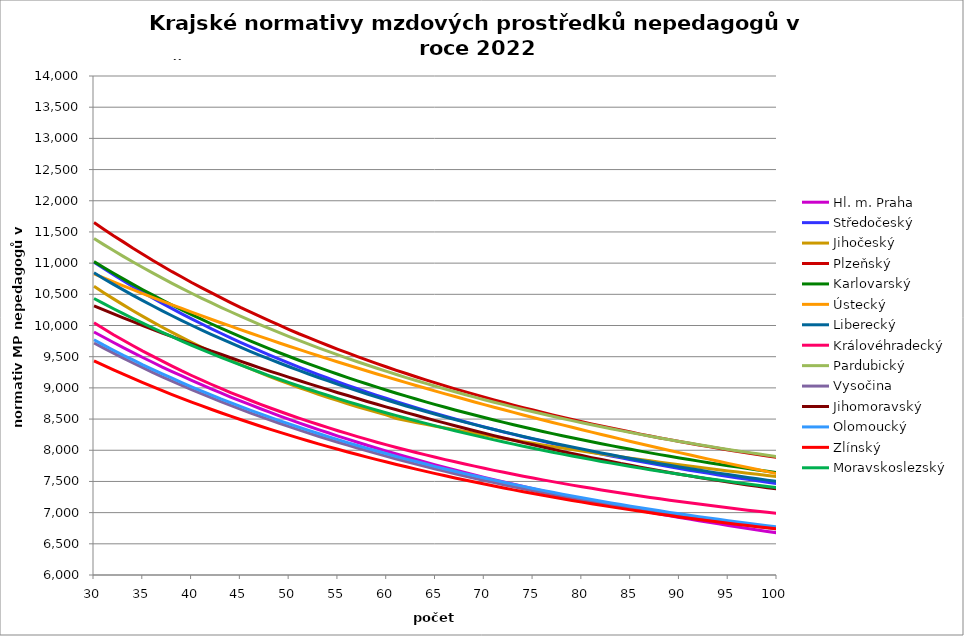
| Category | Hl. m. Praha | Středočeský | Jihočeský | Plzeňský | Karlovarský  | Ústecký   | Liberecký | Královéhradecký | Pardubický | Vysočina | Jihomoravský | Olomoucký | Zlínský | Moravskoslezský |
|---|---|---|---|---|---|---|---|---|---|---|---|---|---|---|
| 30.0 | 9896.653 | 11013.812 | 10629.666 | 11651.816 | 11023.563 | 10827.84 | 10844.475 | 10043.966 | 11394.183 | 9720.182 | 10314.233 | 9770.792 | 9433.517 | 10433.238 |
| 31.0 | 9811.13 | 10912.276 | 10526.706 | 11544.662 | 10929.124 | 10763.26 | 10750.876 | 9947.492 | 11296.568 | 9636.99 | 10249.816 | 9684.42 | 9360.437 | 10350.162 |
| 32.0 | 9727.073 | 10813.371 | 10426.946 | 11439.461 | 10837.004 | 10699.447 | 10659.589 | 9852.854 | 11201.352 | 9555.843 | 10186.199 | 9603.068 | 9289.037 | 10269.034 |
| 33.0 | 9644.444 | 10717.002 | 10330.261 | 11340.613 | 10747.129 | 10636.385 | 10570.537 | 9763.408 | 11108.455 | 9476.363 | 10123.367 | 9523.071 | 9219.264 | 10189.794 |
| 34.0 | 9566.431 | 10623.085 | 10236.533 | 11239.081 | 10659.426 | 10574.062 | 10483.647 | 9675.571 | 11017.803 | 9399.113 | 10061.305 | 9447.79 | 9151.071 | 10112.384 |
| 35.0 | 9486.497 | 10531.533 | 10145.649 | 11143.651 | 10573.823 | 10512.466 | 10398.849 | 9589.3 | 10929.322 | 9323.716 | 10000 | 9370.349 | 9084.411 | 10036.748 |
| 36.0 | 9411.008 | 10442.269 | 10057.504 | 11045.601 | 10490.256 | 10451.583 | 10316.076 | 9507.786 | 10842.945 | 9250.112 | 9939.437 | 9297.454 | 9019.238 | 9962.834 |
| 37.0 | 9333.64 | 10355.216 | 9971.998 | 10953.414 | 10408.66 | 10391.401 | 10235.265 | 9427.647 | 10758.606 | 9177.954 | 9879.603 | 9225.684 | 8955.511 | 9890.59 |
| 38.0 | 9260.555 | 10270.301 | 9889.034 | 10862.754 | 10328.974 | 10331.908 | 10156.354 | 9348.847 | 10676.241 | 9107.776 | 9820.486 | 9155.014 | 8893.186 | 9819.967 |
| 39.0 | 9191.58 | 10187.455 | 9808.523 | 10777.604 | 10251.139 | 10273.093 | 10079.285 | 9271.353 | 10595.789 | 9038.946 | 9762.071 | 9085.418 | 8832.226 | 9750.919 |
| 40.0 | 9120.694 | 10106.611 | 9730.379 | 10689.819 | 10175.1 | 10214.943 | 10004.002 | 9198.158 | 10517.194 | 8971.987 | 9704.348 | 9016.872 | 8772.59 | 9683.401 |
| 41.0 | 9050.893 | 10027.707 | 9654.52 | 10607.348 | 10100.803 | 10157.448 | 9930.45 | 9129.089 | 10440.398 | 8906.563 | 9647.303 | 8952.4 | 8714.244 | 9617.369 |
| 42.0 | 8984.995 | 9950.681 | 9580.868 | 10526.139 | 10028.196 | 10100.597 | 9858.58 | 9058.115 | 10365.35 | 8842.357 | 9590.925 | 8888.844 | 8657.151 | 9552.781 |
| 43.0 | 8920.05 | 9875.476 | 9509.349 | 10446.165 | 9957.23 | 10044.378 | 9788.34 | 8991.125 | 10291.998 | 8779.873 | 9538.462 | 8823.221 | 8601.277 | 9489.598 |
| 44.0 | 8853.275 | 9802.036 | 9439.894 | 10367.397 | 9887.857 | 9988.782 | 9719.684 | 8925.12 | 10220.294 | 8718.793 | 9483.345 | 8764.4 | 8546.591 | 9427.781 |
| 45.0 | 8790.214 | 9730.307 | 9372.436 | 10289.808 | 9820.033 | 9933.798 | 9652.567 | 8862.884 | 10150.189 | 8658.816 | 9428.861 | 8703.476 | 8493.059 | 9367.293 |
| 46.0 | 8730.729 | 9660.239 | 9306.91 | 10216.985 | 9753.712 | 9879.416 | 9586.944 | 8801.511 | 10081.638 | 8600.686 | 9375 | 8643.393 | 8440.653 | 9308.098 |
| 47.0 | 8669.395 | 9591.782 | 9243.257 | 10145.186 | 9688.854 | 9825.626 | 9522.773 | 8740.982 | 10014.6 | 8543.331 | 9321.751 | 8586.937 | 8389.342 | 9250.163 |
| 48.0 | 8611.529 | 9524.889 | 9181.418 | 10074.389 | 9625.417 | 9772.419 | 9460.015 | 8681.279 | 9949.03 | 8487.236 | 9269.103 | 8531.213 | 8339.1 | 9193.454 |
| 49.0 | 8551.853 | 9459.517 | 9121.337 | 10004.574 | 9563.364 | 9719.785 | 9398.63 | 8625.046 | 9884.89 | 8432.613 | 9220.093 | 8476.209 | 8289.897 | 9137.939 |
| 50.0 | 8495.54 | 9395.62 | 9062.963 | 9935.719 | 9502.656 | 9667.714 | 9338.581 | 8569.537 | 9822.141 | 8379.175 | 9168.584 | 8421.909 | 8241.71 | 9083.588 |
| 51.0 | 8439.964 | 9333.158 | 9006.244 | 9867.806 | 9443.257 | 9616.199 | 9279.832 | 8514.738 | 9760.746 | 8326.651 | 9117.647 | 8368.3 | 8194.511 | 9030.372 |
| 52.0 | 8385.111 | 9272.09 | 8951.134 | 9804.143 | 9385.134 | 9565.23 | 9222.349 | 8463.196 | 9700.668 | 8275.494 | 9067.273 | 8318.001 | 8148.278 | 8978.261 |
| 53.0 | 8330.966 | 9212.379 | 8897.585 | 9741.296 | 9328.252 | 9514.798 | 9166.098 | 8412.274 | 9641.874 | 8225.196 | 9020.369 | 8268.302 | 8102.986 | 8927.229 |
| 54.0 | 8279.93 | 9153.987 | 8845.555 | 9679.249 | 9272.58 | 9464.895 | 9111.048 | 8361.962 | 9584.33 | 8175.97 | 8971.061 | 8219.193 | 8058.612 | 8877.248 |
| 55.0 | 8227.13 | 9096.878 | 8795 | 9617.988 | 9218.086 | 9415.513 | 9057.167 | 8312.247 | 9528.005 | 8128.246 | 8922.29 | 8170.665 | 8015.136 | 8828.294 |
| 56.0 | 8177.355 | 9041.02 | 8745.882 | 9560.662 | 9164.742 | 9366.644 | 9004.427 | 8265.563 | 9472.867 | 8081.303 | 8876.869 | 8122.706 | 7972.535 | 8780.342 |
| 57.0 | 8128.179 | 8986.378 | 8698.161 | 9500.888 | 9112.517 | 9318.279 | 8952.797 | 8219.4 | 9418.886 | 8035.123 | 8829.114 | 8075.307 | 7930.79 | 8733.368 |
| 58.0 | 8079.59 | 8932.922 | 8651.801 | 9444.946 | 9061.385 | 9270.411 | 8902.251 | 8173.75 | 9366.035 | 7989.91 | 8781.87 | 8030.91 | 7889.88 | 8687.348 |
| 59.0 | 8031.579 | 8880.62 | 8606.767 | 9389.659 | 9011.319 | 9223.032 | 8852.762 | 8128.605 | 9314.286 | 7945.642 | 8737.864 | 7986.999 | 7849.787 | 8642.261 |
| 60.0 | 7986.382 | 8829.444 | 8563.026 | 9335.015 | 8962.293 | 9176.136 | 8804.304 | 8086.293 | 9263.611 | 7902.511 | 8691.589 | 7943.565 | 7810.492 | 8598.085 |
| 61.0 | 7939.469 | 8779.365 | 8508.044 | 9281.003 | 8914.282 | 9129.713 | 8756.852 | 8044.419 | 9213.986 | 7860.275 | 8648.481 | 7900.601 | 7771.978 | 8554.8 |
| 62.0 | 7895.299 | 8730.356 | 8476.848 | 9230.563 | 8867.261 | 9083.758 | 8710.383 | 8005.268 | 9165.385 | 7818.7 | 8603.145 | 7858.099 | 7734.226 | 8512.385 |
| 63.0 | 7851.618 | 8682.39 | 8446.115 | 9177.75 | 8821.209 | 9038.264 | 8664.874 | 7964.227 | 9117.784 | 7778.192 | 8560.908 | 7818.376 | 7697.221 | 8470.821 |
| 64.0 | 7808.418 | 8635.443 | 8415.838 | 9128.422 | 8776.102 | 8993.223 | 8620.301 | 7925.85 | 9071.161 | 7738.309 | 8516.484 | 7779.053 | 7660.946 | 8430.09 |
| 65.0 | 7765.691 | 8589.49 | 8386.009 | 9079.623 | 8731.919 | 8948.628 | 8576.645 | 7887.842 | 9025.492 | 7699.45 | 8475.091 | 7737.846 | 7625.385 | 8390.173 |
| 66.0 | 7723.429 | 8544.506 | 8356.62 | 9031.342 | 8688.639 | 8904.474 | 8533.882 | 7850.197 | 8980.757 | 7661.386 | 8434.099 | 7699.327 | 7590.524 | 8351.052 |
| 67.0 | 7683.703 | 8500.471 | 8327.666 | 8983.572 | 8646.242 | 8860.753 | 8491.995 | 7815.092 | 8936.935 | 7624.101 | 8393.502 | 7663.422 | 7556.348 | 8312.711 |
| 68.0 | 7642.326 | 8457.36 | 8299.138 | 8939.071 | 8604.708 | 8817.459 | 8450.963 | 7780.301 | 8894.004 | 7587.176 | 8353.293 | 7625.638 | 7522.843 | 8275.134 |
| 69.0 | 7603.429 | 8415.154 | 8271.031 | 8895.009 | 8564.018 | 8774.587 | 8410.767 | 7745.817 | 8851.946 | 7551.399 | 8313.468 | 7590.416 | 7489.995 | 8238.303 |
| 70.0 | 7564.925 | 8373.832 | 8243.338 | 8851.38 | 8524.155 | 8732.129 | 8371.389 | 7711.638 | 8810.742 | 7516.349 | 8274.021 | 7555.517 | 7457.79 | 8202.205 |
| 71.0 | 7526.81 | 8333.373 | 8216.052 | 8808.176 | 8485.099 | 8690.08 | 8332.812 | 7677.759 | 8770.374 | 7481.818 | 8234.947 | 7520.938 | 7426.216 | 8166.823 |
| 72.0 | 7491.053 | 8293.76 | 8189.167 | 8765.392 | 8446.835 | 8648.435 | 8295.018 | 7646.267 | 8730.823 | 7448.18 | 8196.24 | 7486.674 | 7395.26 | 8132.144 |
| 73.0 | 7453.676 | 8254.973 | 8162.677 | 8723.021 | 8409.346 | 8607.186 | 8257.992 | 7615.033 | 8692.074 | 7414.842 | 8160.281 | 7452.721 | 7364.911 | 8098.154 |
| 74.0 | 7418.61 | 8216.994 | 8136.576 | 8683.669 | 8372.615 | 8566.329 | 8221.717 | 7584.052 | 8654.108 | 7382.559 | 8122.271 | 7421.169 | 7335.156 | 8064.839 |
| 75.0 | 7381.951 | 8179.807 | 8110.858 | 8644.671 | 8336.628 | 8525.858 | 8186.177 | 7555.363 | 8616.911 | 7350.93 | 8086.957 | 7387.806 | 7305.984 | 8032.186 |
| 76.0 | 7347.554 | 8143.393 | 8085.518 | 8606.021 | 8301.369 | 8485.768 | 8151.358 | 7524.865 | 8580.466 | 7319.942 | 8051.948 | 7356.799 | 7277.384 | 8000.182 |
| 77.0 | 7313.476 | 8107.739 | 8060.55 | 8567.715 | 8266.823 | 8446.053 | 8117.246 | 7496.622 | 8544.76 | 7289.399 | 8014.938 | 7326.052 | 7249.345 | 7968.814 |
| 78.0 | 7279.713 | 8072.827 | 8035.948 | 8529.749 | 8232.978 | 8406.708 | 8083.826 | 7468.59 | 8509.776 | 7259.476 | 7980.549 | 7295.56 | 7221.858 | 7938.072 |
| 79.0 | 7248.11 | 8038.642 | 8011.708 | 8494.616 | 8199.818 | 8367.728 | 8051.085 | 7440.766 | 8475.501 | 7230.341 | 7948.718 | 7267.33 | 7194.911 | 7907.943 |
| 80.0 | 7214.947 | 8005.17 | 7987.824 | 8457.293 | 8167.331 | 8329.108 | 8019.01 | 7415.115 | 8441.922 | 7201.619 | 7914.894 | 7239.317 | 7168.496 | 7878.415 |
| 81.0 | 7183.903 | 7972.397 | 7964.291 | 8422.754 | 8135.504 | 8290.842 | 7987.588 | 7389.641 | 8409.025 | 7173.66 | 7881.356 | 7209.542 | 7142.602 | 7849.479 |
| 82.0 | 7153.125 | 7940.309 | 7941.104 | 8388.495 | 8104.324 | 8252.927 | 7956.806 | 7364.34 | 8376.797 | 7146.094 | 7850.31 | 7181.972 | 7117.22 | 7821.124 |
| 83.0 | 7122.61 | 7908.893 | 7918.259 | 8356.932 | 8073.78 | 8215.357 | 7926.653 | 7339.213 | 8345.226 | 7119.091 | 7819.507 | 7154.612 | 7092.343 | 7793.338 |
| 84.0 | 7092.354 | 7878.135 | 7895.75 | 8323.206 | 8043.86 | 8178.127 | 7897.117 | 7314.256 | 8314.3 | 7092.64 | 7786.771 | 7129.393 | 7067.96 | 7766.113 |
| 85.0 | 7062.354 | 7848.024 | 7873.573 | 8292.131 | 8014.552 | 8141.233 | 7868.187 | 7289.468 | 8284.007 | 7066.905 | 7758.621 | 7102.431 | 7044.063 | 7739.439 |
| 86.0 | 7032.607 | 7818.548 | 7851.723 | 8258.924 | 7985.846 | 8104.671 | 7839.852 | 7266.736 | 8254.336 | 7041.7 | 7728.532 | 7077.577 | 7020.645 | 7713.306 |
| 87.0 | 7004.837 | 7789.694 | 7830.197 | 8228.327 | 7957.731 | 8068.435 | 7812.101 | 7244.145 | 8225.275 | 7016.845 | 7698.675 | 7052.897 | 6997.697 | 7687.705 |
| 88.0 | 6977.286 | 7761.451 | 7808.989 | 8197.956 | 7930.197 | 8032.522 | 7784.925 | 7221.694 | 8196.816 | 6992.504 | 7671.158 | 7028.388 | 6975.213 | 7662.627 |
| 89.0 | 6949.951 | 7733.808 | 7788.096 | 8170.119 | 7903.234 | 7996.928 | 7758.313 | 7199.382 | 8168.946 | 6968.668 | 7643.836 | 7004.049 | 6953.183 | 7638.064 |
| 90.0 | 6922.829 | 7706.756 | 7767.513 | 8140.175 | 7876.831 | 7961.647 | 7732.256 | 7179.05 | 8141.655 | 6945.497 | 7616.708 | 6981.731 | 6931.601 | 7614.008 |
| 91.0 | 6895.918 | 7680.282 | 7747.236 | 8112.728 | 7850.98 | 7926.676 | 7706.744 | 7157 | 8114.935 | 6922.811 | 7589.771 | 6957.714 | 6910.461 | 7590.449 |
| 92.0 | 6869.216 | 7654.379 | 7727.262 | 8085.466 | 7825.672 | 7892.012 | 7681.768 | 7136.907 | 8088.776 | 6900.438 | 7563.025 | 6935.69 | 6889.754 | 7567.382 |
| 93.0 | 6844.369 | 7629.035 | 7707.587 | 8058.387 | 7800.897 | 7857.649 | 7657.32 | 7116.925 | 8063.169 | 6878.538 | 7538.503 | 6913.805 | 6869.475 | 7544.797 |
| 94.0 | 6819.702 | 7604.241 | 7688.206 | 8031.488 | 7776.648 | 7823.584 | 7633.39 | 7097.056 | 8038.104 | 6857.102 | 7514.14 | 6892.058 | 6849.617 | 7522.688 |
| 95.0 | 6793.585 | 7579.989 | 7669.116 | 8004.769 | 7752.915 | 7789.813 | 7609.972 | 7077.297 | 8013.573 | 6836.286 | 7489.933 | 6870.447 | 6830.174 | 7501.047 |
| 96.0 | 6769.282 | 7556.269 | 7650.314 | 7980.431 | 7729.691 | 7756.332 | 7587.056 | 7059.429 | 7989.569 | 6815.757 | 7465.882 | 6850.756 | 6811.139 | 7479.868 |
| 97.0 | 6746.755 | 7533.073 | 7631.796 | 7956.241 | 7706.968 | 7723.138 | 7564.635 | 7039.879 | 7966.081 | 6795.832 | 7443.97 | 6831.177 | 6792.508 | 7459.143 |
| 98.0 | 6722.785 | 7510.393 | 7613.558 | 7932.198 | 7684.738 | 7690.227 | 7542.702 | 7022.2 | 7943.104 | 6776.023 | 7422.187 | 6809.946 | 6774.273 | 7438.867 |
| 99.0 | 6698.985 | 7488.22 | 7595.598 | 7908.299 | 7662.994 | 7657.595 | 7521.248 | 7004.609 | 7920.629 | 6756.962 | 7398.568 | 6790.599 | 6756.43 | 7419.032 |
| 100.0 | 6676.923 | 7466.548 | 7577.911 | 7884.544 | 7641.729 | 7625.239 | 7500.268 | 6987.106 | 7898.649 | 6738.166 | 7379 | 6773.107 | 6738.973 | 7399.633 |